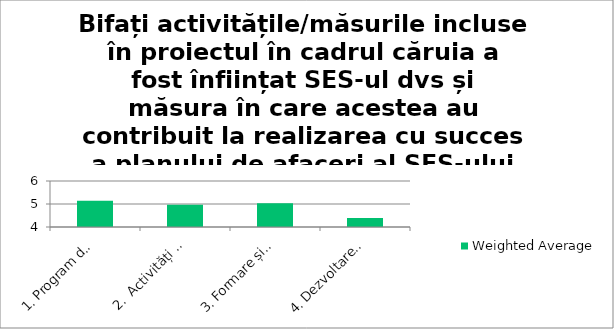
| Category | Weighted Average |
|---|---|
| 1. Program de formare (antreprenoriat social) | 5.14 |
| 2.  Activități de sprijin pentru înființarea SES (informare, consiliere) | 4.97 |
| 3. Formare și certificare a specialiștilor în economie socială | 5.03 |
| 4. Dezvoltarea de parteneriate în domeniul economiei sociale | 4.39 |